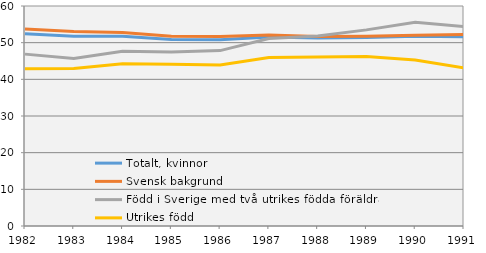
| Category | Totalt, kvinnor | Svensk bakgrund | Född i Sverige med två utrikes födda föräldrar | Utrikes född |
|---|---|---|---|---|
| 1982.0 | 52.458 | 53.725 | 46.876 | 42.878 |
| 1983.0 | 51.735 | 53.012 | 45.662 | 42.957 |
| 1984.0 | 51.762 | 52.793 | 47.655 | 44.236 |
| 1985.0 | 50.85 | 51.765 | 47.48 | 44.133 |
| 1986.0 | 50.791 | 51.656 | 47.839 | 43.927 |
| 1987.0 | 51.513 | 52.093 | 51.121 | 45.965 |
| 1988.0 | 51.253 | 51.711 | 51.801 | 46.12 |
| 1989.0 | 51.398 | 51.75 | 53.489 | 46.213 |
| 1990.0 | 51.752 | 52.05 | 55.553 | 45.289 |
| 1991.0 | 51.616 | 52.197 | 54.413 | 43.102 |